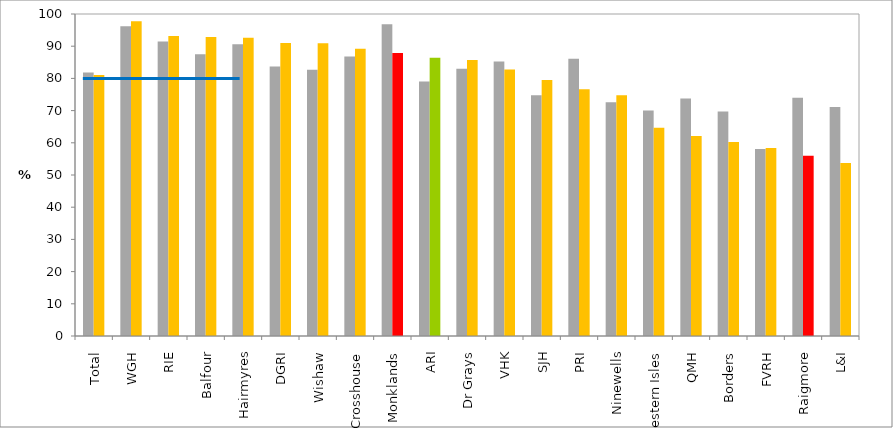
| Category | 2017 (%) | 2018 (%) |
|---|---|---|
| Total | 81.853 | 81.073 |
| WGH | 96.205 | 97.732 |
| RIE | 91.469 | 93.162 |
| Balfour | 87.5 | 92.857 |
| Hairmyres | 90.625 | 92.614 |
| DGRI | 83.688 | 90.977 |
| Wishaw | 82.677 | 90.909 |
| Crosshouse | 86.798 | 89.213 |
| Monklands | 96.855 | 87.898 |
| ARI | 79.01 | 86.441 |
| Dr Grays | 82.979 | 85.714 |
| VHK | 85.214 | 82.727 |
| SJH | 74.747 | 79.487 |
| PRI | 86.093 | 76.613 |
| Ninewells | 72.609 | 74.771 |
| Western Isles | 70 | 64.706 |
| QMH | 73.743 | 62.092 |
| Borders | 69.753 | 60.265 |
| FVRH | 58.039 | 58.369 |
| Raigmore | 74.026 | 56.015 |
| L&I | 71.111 | 53.731 |